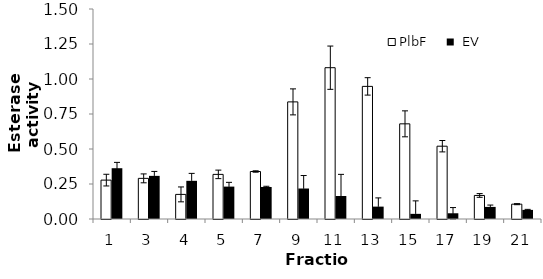
| Category | PlbF |  EV |
|---|---|---|
| 1.0 | 0.278 | 0.363 |
| 3.0 | 0.29 | 0.308 |
| 4.0 | 0.176 | 0.273 |
| 5.0 | 0.319 | 0.231 |
| 7.0 | 0.339 | 0.229 |
| 9.0 | 0.837 | 0.218 |
| 11.0 | 1.081 | 0.164 |
| 13.0 | 0.947 | 0.088 |
| 15.0 | 0.68 | 0.037 |
| 17.0 | 0.52 | 0.041 |
| 19.0 | 0.168 | 0.086 |
| 21.0 | 0.106 | 0.065 |